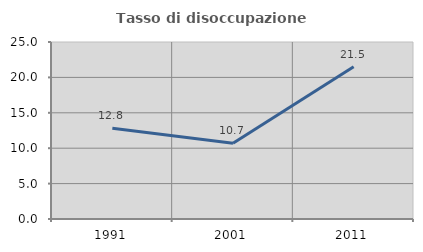
| Category | Tasso di disoccupazione giovanile  |
|---|---|
| 1991.0 | 12.828 |
| 2001.0 | 10.7 |
| 2011.0 | 21.512 |